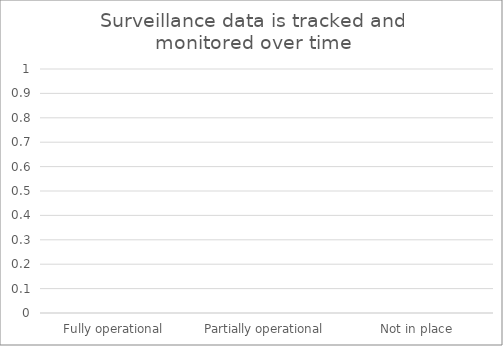
| Category | Surveillance data is tracked and monitored over time |
|---|---|
| Fully operational | 0 |
| Partially operational | 0 |
| Not in place | 0 |